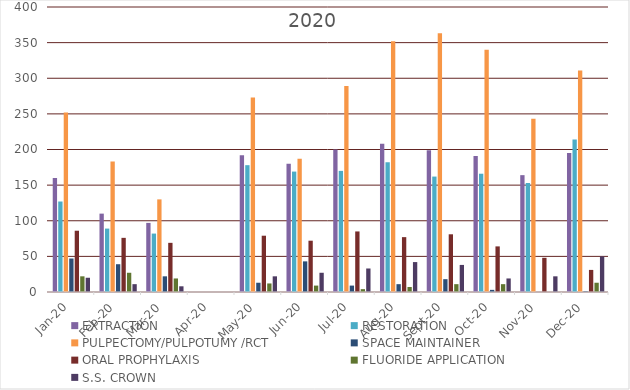
| Category | EXTRACTION | RESTORATION | PULPECTOMY/PULPOTUMY /RCT | SPACE MAINTAINER | ORAL PROPHYLAXIS | FLUORIDE APPLICATION | S.S. CROWN  |
|---|---|---|---|---|---|---|---|
| 2020-01-01 | 160 | 127 | 252 | 47 | 86 | 22 | 20 |
| 2020-02-01 | 110 | 89 | 183 | 39 | 76 | 27 | 11 |
| 2020-03-01 | 97 | 82 | 130 | 22 | 69 | 19 | 8 |
| 2020-04-01 | 0 | 0 | 0 | 0 | 0 | 0 | 0 |
| 2020-05-01 | 192 | 178 | 273 | 13 | 79 | 12 | 22 |
| 2020-06-01 | 180 | 169 | 187 | 43 | 72 | 9 | 27 |
| 2020-07-01 | 200 | 170 | 289 | 9 | 85 | 4 | 33 |
| 2020-08-01 | 208 | 182 | 352 | 11 | 77 | 7 | 42 |
| 2020-09-01 | 199 | 162 | 363 | 18 | 81 | 11 | 38 |
| 2020-10-01 | 191 | 166 | 340 | 3 | 64 | 11 | 19 |
| 2020-11-01 | 164 | 153 | 243 | 0 | 48 | 0 | 22 |
| 2020-12-01 | 195 | 214 | 311 | 1 | 31 | 13 | 50 |